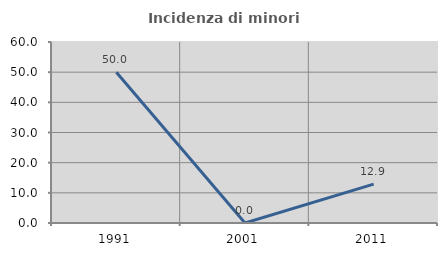
| Category | Incidenza di minori stranieri |
|---|---|
| 1991.0 | 50 |
| 2001.0 | 0 |
| 2011.0 | 12.903 |